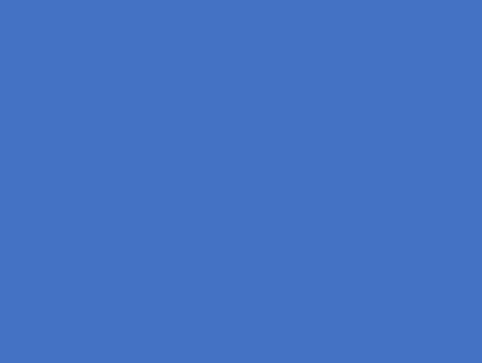
| Category | Series 0 |
|---|---|
| Número de usuarios que presentaron propuesta de carga | 0 |
| Número de usuarios que no presentaroon y por ley  se les calculará la carga con métodos presuntivos | 0 |